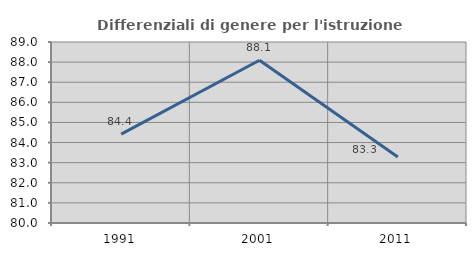
| Category | Differenziali di genere per l'istruzione superiore |
|---|---|
| 1991.0 | 84.419 |
| 2001.0 | 88.091 |
| 2011.0 | 83.284 |